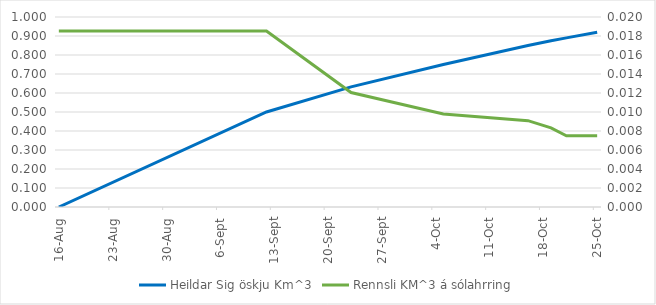
| Category | Heildar Sig öskju Km^3 |
|---|---|
| 2014-08-16 | 0 |
| 2014-09-12 | 0.5 |
| 2014-09-23 | 0.633 |
| 2014-10-05 | 0.75 |
| 2014-10-16 | 0.85 |
| 2014-10-19 | 0.875 |
| 2014-10-21 | 0.89 |
| 2014-10-25 | 0.92 |